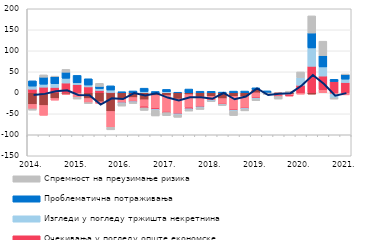
| Category | Трошкови извора за кредите | Конкуренција осталих банака | Очекивања у погледу опште економске ситуације | Изгледи у погледу тржишта некретнина | Проблематична потраживања | Спремност на преузимање ризика |
|---|---|---|---|---|---|---|
| 2014. | -27.614 | -10.883 | 8.513 | 7.366 | 12.572 | -2.931 |
|  | -30.154 | -23.565 | 13.381 | 6.958 | 16.79 | 5.591 |
|  | -13.58 | -4.04 | 12.84 | 8.698 | 16.68 | 1.322 |
|  | -3.194 | -0.943 | 23.215 | 11.346 | 14.413 | 6.815 |
| 2015. | 1.584 | -10.634 | 17.798 | 4.391 | 17.665 | -4.309 |
|  | -13.709 | -9.748 | 14.011 | 4.433 | 14.906 | -2.291 |
|  | -21.32 | -4.036 | 5.521 | 4.364 | 5.262 | 7.435 |
|  | -44.371 | -37.787 | 0.672 | 5.886 | 9.984 | -6.068 |
| 2016. | -13.683 | -9.865 | -0.183 | -2.017 | 2.537 | -5.896 |
|  | -11.339 | -9.602 | -0.197 | -1.974 | 4.34 | -2.332 |
|  | -16.54 | -16.708 | -2.652 | 2.885 | 8.061 | -6.073 |
|  | -6.439 | -30.804 | -2.596 | -1.957 | 3.101 | -13.396 |
| 2017. | -6.563 | -40.484 | -0.096 | 2.394 | 5.669 | -7.434 |
|  | -14.708 | -34.121 | -1.211 | -2.234 | 1.309 | -6.144 |
|  | -4.365 | -31.359 | -2.483 | -2.033 | 8.902 | -3.307 |
|  | -9.63 | -23.589 | -0.294 | -2.083 | 3.686 | -4.267 |
| 2018. | -8.401 | -9.465 | -0.308 | -2.087 | 3.545 | -0.758 |
|  | -13.817 | -13.719 | -0.384 | -1.143 | 1.627 | -1.188 |
|  | -8.391 | -32.723 | -0.405 | -2.001 | 3.96 | -10.656 |
|  | -8.386 | -28.581 | -0.415 | -2.043 | 4.097 | -3.682 |
| 2019. | 7.614 | -12.529 | -0.41 | -2.062 | 4.174 | -3.764 |
|  | -0.003 | 0 | -0.494 | 0 | 4.55 | -3.594 |
|  | -3.529 | -4.583 | -0.546 | 0 | 0 | -6.275 |
|  | -3.387 | -3.387 | -0.556 | 0 | 0 | 3.746 |
| 2020. | 0 | -3.33 | 17.776 | 18.324 | 0 | 13.516 |
|  | -3.256 | 0 | 63.053 | 43.711 | 35.524 | 40.823 |
|  | 0 | 7.248 | 32.599 | 21.695 | 27.071 | 34.236 |
|  | -0.778 | -3.063 | 26.746 | -8.12 | 5.298 | -3.047 |
| 2021. | 0 | -5.032 | 24.468 | 7.975 | 11.008 | 0.658 |